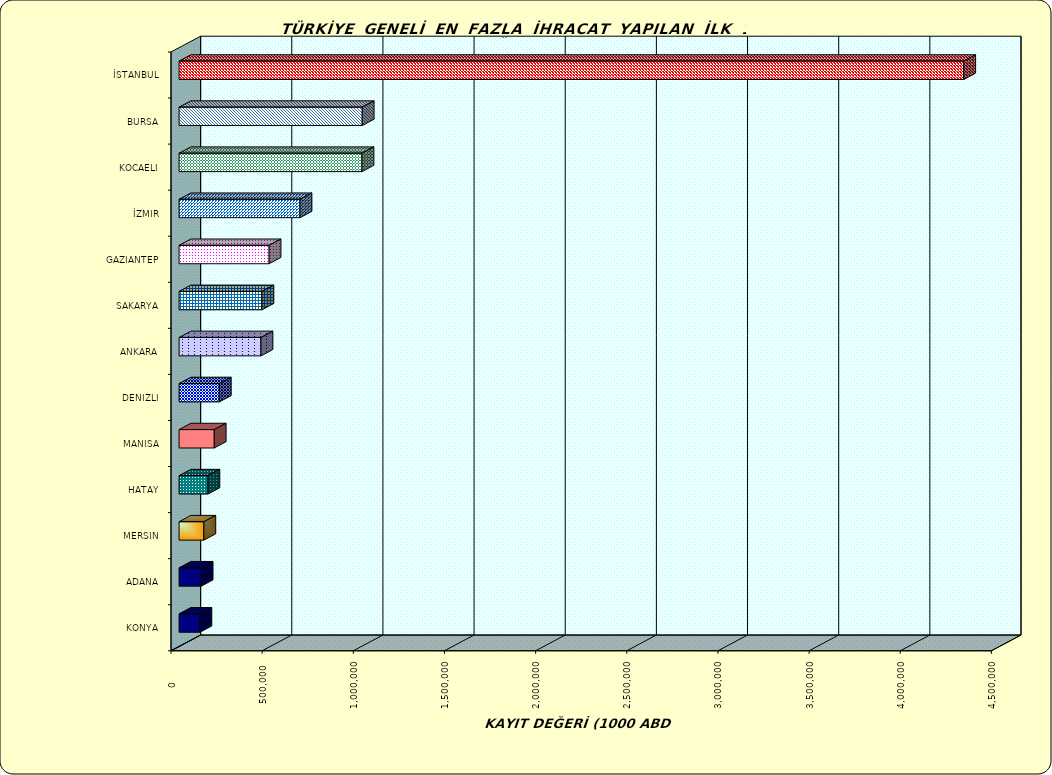
| Category | Series 0 |
|---|---|
| İSTANBUL | 4304088.012 |
| BURSA | 1004661.756 |
| KOCAELI | 1003422.672 |
| İZMIR | 663495.387 |
| GAZIANTEP | 493908.881 |
| SAKARYA | 454536.983 |
| ANKARA | 449482.887 |
| DENIZLI | 220611.157 |
| MANISA | 192981.225 |
| HATAY | 158217.078 |
| MERSIN | 136035.677 |
| ADANA | 121104.177 |
| KONYA | 114496.63 |